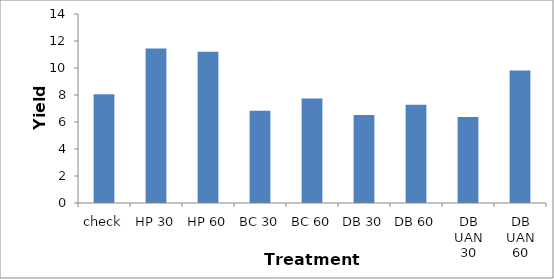
| Category | Series 0 |
|---|---|
| check | 8.049 |
| HP 30 | 11.453 |
| HP 60 | 11.204 |
| BC 30 | 6.838 |
| BC 60 | 7.739 |
| DB 30 | 6.523 |
| DB 60 | 7.272 |
| DB UAN 30 | 6.376 |
| DB UAN 60 | 9.821 |